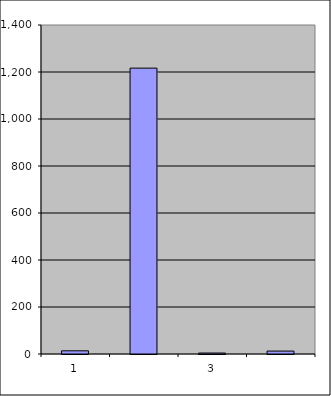
| Category | Series 0 |
|---|---|
| 0 | 13.5 |
| 1 | 1216.489 |
| 2 | 4.143 |
| 3 | 12.389 |